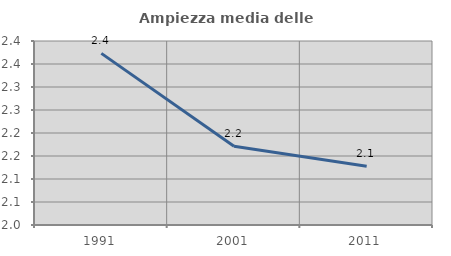
| Category | Ampiezza media delle famiglie |
|---|---|
| 1991.0 | 2.373 |
| 2001.0 | 2.171 |
| 2011.0 | 2.128 |